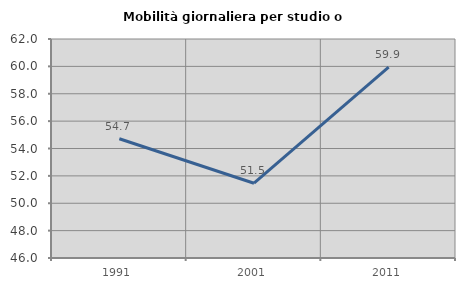
| Category | Mobilità giornaliera per studio o lavoro |
|---|---|
| 1991.0 | 54.712 |
| 2001.0 | 51.464 |
| 2011.0 | 59.941 |